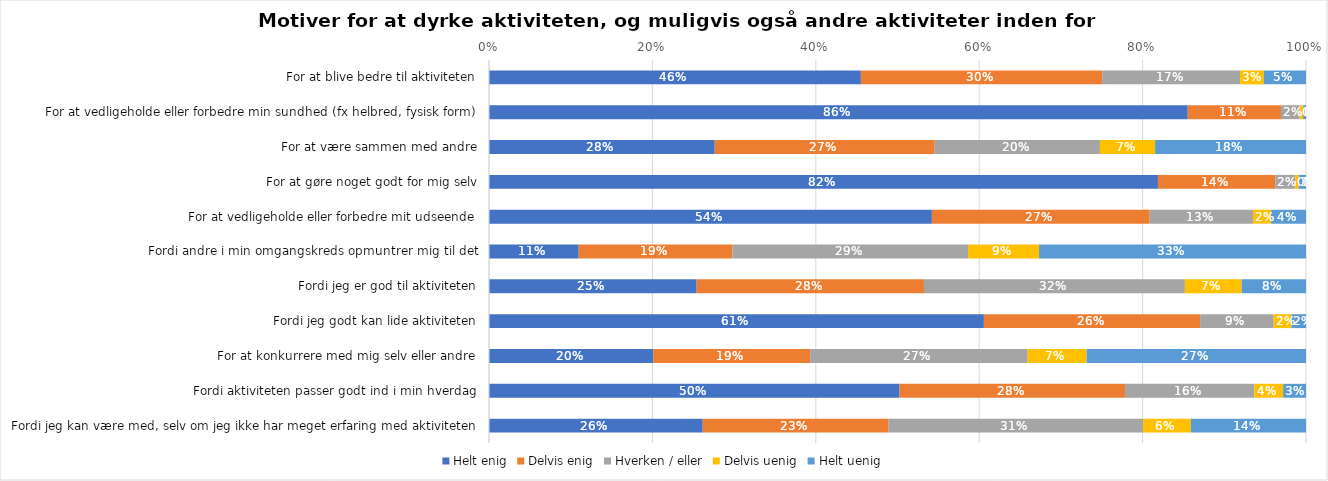
| Category | Helt enig | Delvis enig | Hverken / eller | Delvis uenig | Helt uenig |
|---|---|---|---|---|---|
| For at blive bedre til aktiviteten | 0.455 | 0.295 | 0.169 | 0.029 | 0.052 |
| For at vedligeholde eller forbedre min sundhed (fx helbred, fysisk form) | 0.855 | 0.114 | 0.023 | 0.004 | 0.003 |
| For at være sammen med andre | 0.276 | 0.269 | 0.202 | 0.068 | 0.185 |
| For at gøre noget godt for mig selv | 0.819 | 0.144 | 0.024 | 0.004 | 0.009 |
| For at vedligeholde eller forbedre mit udseende | 0.542 | 0.267 | 0.127 | 0.022 | 0.043 |
| Fordi andre i min omgangskreds opmuntrer mig til det | 0.11 | 0.188 | 0.288 | 0.087 | 0.327 |
| Fordi jeg er god til aktiviteten | 0.254 | 0.278 | 0.319 | 0.069 | 0.079 |
| Fordi jeg godt kan lide aktiviteten | 0.606 | 0.265 | 0.09 | 0.022 | 0.018 |
| For at konkurrere med mig selv eller andre | 0.201 | 0.192 | 0.266 | 0.072 | 0.269 |
| Fordi aktiviteten passer godt ind i min hverdag | 0.503 | 0.276 | 0.158 | 0.035 | 0.028 |
| Fordi jeg kan være med, selv om jeg ikke har meget erfaring med aktiviteten | 0.262 | 0.227 | 0.311 | 0.059 | 0.141 |